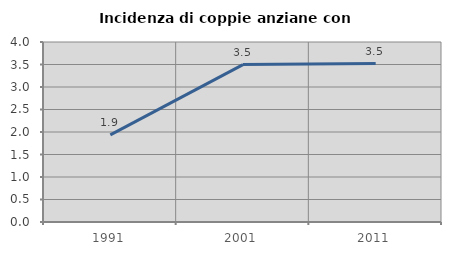
| Category | Incidenza di coppie anziane con figli |
|---|---|
| 1991.0 | 1.935 |
| 2001.0 | 3.498 |
| 2011.0 | 3.522 |